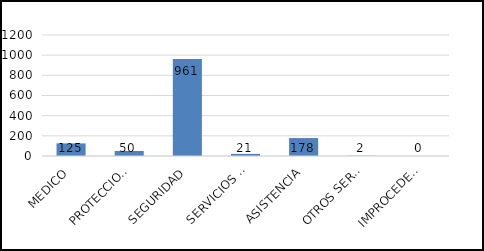
| Category | TOTAL |
|---|---|
| MEDICO | 125 |
| PROTECCION CIVIL | 50 |
| SEGURIDAD | 961 |
| SERVICIOS PUBLICOS | 21 |
| ASISTENCIA | 178 |
| OTROS SERVICIOS | 2 |
| IMPROCEDENTES | 0 |